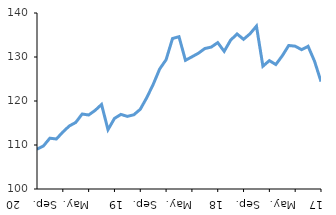
| Category | Series 0 |
|---|---|
| 2017-01-01 | 109.031 |
| 2017-02-01 | 109.788 |
| 2017-03-01 | 111.55 |
| 2017-04-01 | 111.362 |
| 2017-05-01 | 112.944 |
| 2017-06-01 | 114.32 |
| 2017-07-01 | 115.124 |
| 2017-08-01 | 117.046 |
| 2017-09-01 | 116.816 |
| 2017-10-01 | 117.861 |
| 2017-11-01 | 119.208 |
| 2017-12-01 | 113.48 |
| 2018-01-01 | 116.038 |
| 2018-02-01 | 116.953 |
| 2018-03-01 | 116.504 |
| 2018-04-01 | 116.869 |
| 2018-05-01 | 118.118 |
| 2018-06-01 | 120.744 |
| 2018-07-01 | 123.761 |
| 2018-08-01 | 127.259 |
| 2018-09-01 | 129.385 |
| 2018-10-01 | 134.208 |
| 2018-11-01 | 134.611 |
| 2018-12-01 | 129.245 |
| 2019-01-01 | 130.043 |
| 2019-02-01 | 130.852 |
| 2019-03-01 | 131.925 |
| 2019-04-01 | 132.255 |
| 2019-05-01 | 133.269 |
| 2019-06-01 | 131.284 |
| 2019-07-01 | 133.835 |
| 2019-08-01 | 135.234 |
| 2019-09-01 | 134.016 |
| 2019-10-01 | 135.275 |
| 2019-11-01 | 137.019 |
| 2019-12-01 | 127.908 |
| 2020-01-01 | 129.176 |
| 2020-02-01 | 128.295 |
| 2020-03-01 | 130.267 |
| 2020-04-01 | 132.621 |
| 2020-05-01 | 132.456 |
| 2020-06-01 | 131.662 |
| 2020-07-01 | 132.429 |
| 2020-08-01 | 129.037 |
| 2020-09-01 | 124.424 |